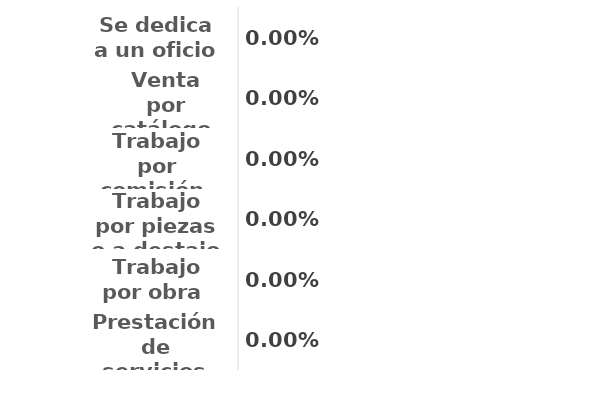
| Category | Series 0 |
|---|---|
| Prestación de servicios | 0 |
| Trabajo por obra  | 0 |
| Trabajo por piezas o a destajo  | 0 |
| Trabajo por comisión  | 0 |
| Venta por catálogo  | 0 |
| Se dedica a un oficio | 0 |